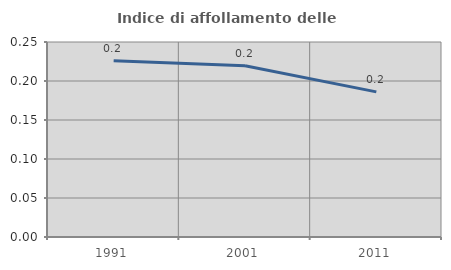
| Category | Indice di affollamento delle abitazioni  |
|---|---|
| 1991.0 | 0.226 |
| 2001.0 | 0.22 |
| 2011.0 | 0.186 |